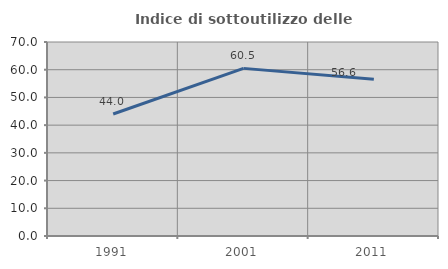
| Category | Indice di sottoutilizzo delle abitazioni  |
|---|---|
| 1991.0 | 44.03 |
| 2001.0 | 60.484 |
| 2011.0 | 56.552 |